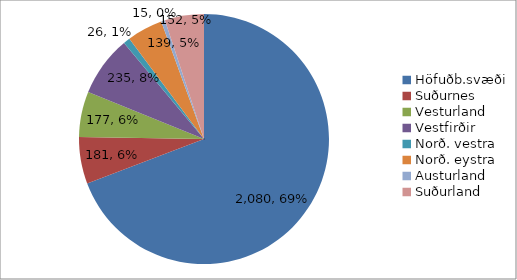
| Category | Series 0 |
|---|---|
| Höfuðb.svæði | 2080 |
| Suðurnes | 181 |
| Vesturland | 177 |
| Vestfirðir | 235 |
| Norð. vestra | 26 |
| Norð. eystra | 139 |
| Austurland | 15 |
| Suðurland | 152 |